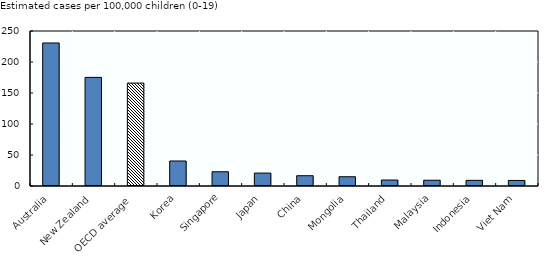
| Category | Series 1 |
|---|---|
| Australia | 230.652 |
| New Zealand | 175.161 |
| OECD average  | 165.981 |
| Korea | 40.328 |
| Singapore | 22.944 |
| Japan | 20.795 |
| China | 16.608 |
| Mongolia | 14.943 |
| Thailand | 9.609 |
| Malaysia | 9.309 |
| Indonesia | 9.103 |
| Viet Nam | 8.966 |